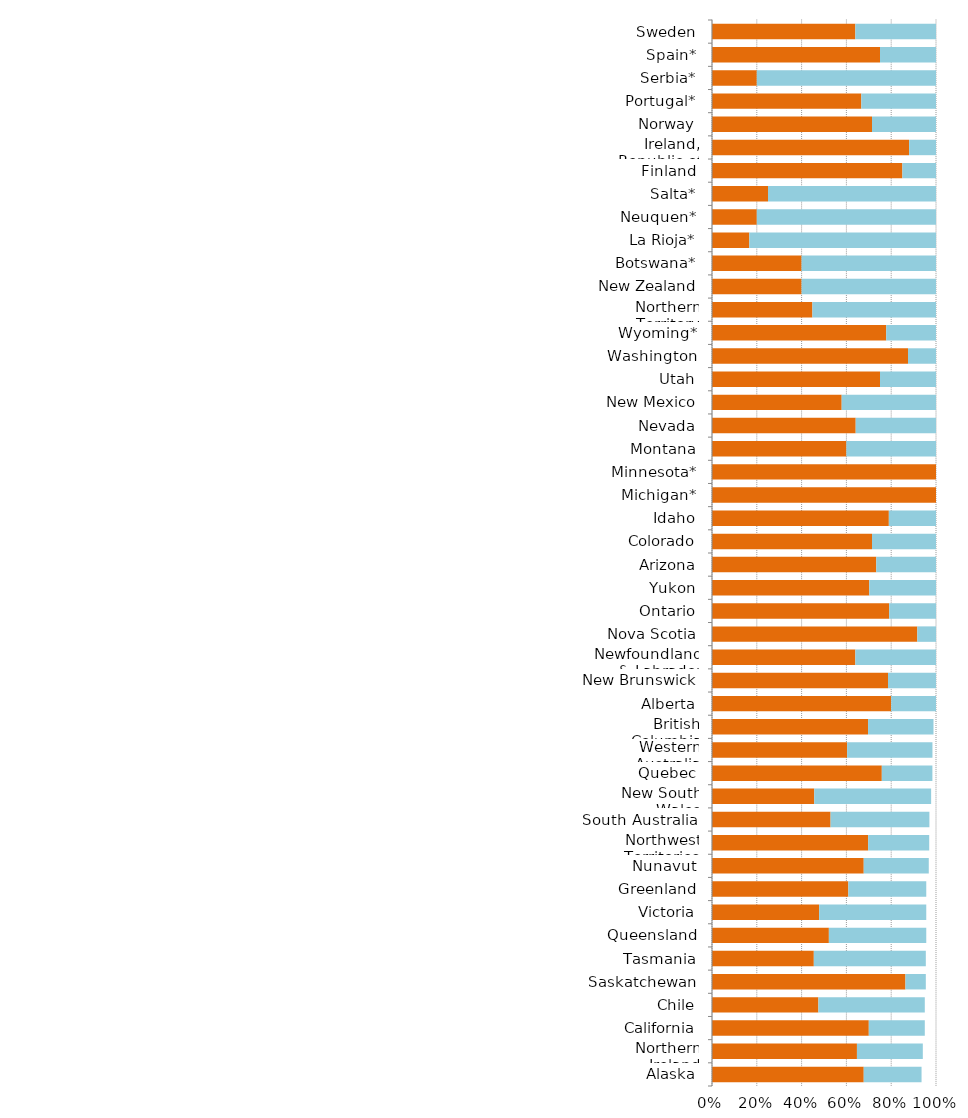
| Category | Series 0 | Series 1 |
|---|---|---|
| Alaska | 0.677 | 0.258 |
| Northern Ireland | 0.647 | 0.294 |
| California | 0.7 | 0.25 |
| Chile | 0.475 | 0.475 |
| Saskatchewan | 0.864 | 0.091 |
| Tasmania | 0.455 | 0.5 |
| Queensland | 0.522 | 0.435 |
| Victoria | 0.478 | 0.478 |
| Greenland | 0.609 | 0.348 |
| Nunavut | 0.677 | 0.29 |
| Northwest Territories | 0.697 | 0.273 |
| South Australia | 0.529 | 0.441 |
| New South Wales | 0.457 | 0.522 |
| Quebec | 0.758 | 0.226 |
| Western Australia | 0.603 | 0.381 |
| British Columbia | 0.697 | 0.292 |
| Alberta | 0.8 | 0.2 |
| New Brunswick | 0.786 | 0.214 |
| Newfoundland & Labrador | 0.64 | 0.36 |
| Nova Scotia | 0.917 | 0.083 |
| Ontario | 0.791 | 0.209 |
| Yukon | 0.702 | 0.298 |
| Arizona | 0.733 | 0.267 |
| Colorado | 0.714 | 0.286 |
| Idaho | 0.789 | 0.211 |
| Michigan* | 1 | 0 |
| Minnesota* | 1 | 0 |
| Montana | 0.6 | 0.4 |
| Nevada | 0.642 | 0.358 |
| New Mexico | 0.579 | 0.421 |
| Utah | 0.75 | 0.25 |
| Washington | 0.875 | 0.125 |
| Wyoming* | 0.778 | 0.222 |
| Northern Territory | 0.448 | 0.552 |
| New Zealand | 0.4 | 0.6 |
| Botswana* | 0.4 | 0.6 |
| La Rioja* | 0.167 | 0.833 |
| Neuquen* | 0.2 | 0.8 |
| Salta* | 0.25 | 0.75 |
| Finland | 0.85 | 0.15 |
| Ireland, Republic of | 0.88 | 0.12 |
| Norway | 0.714 | 0.286 |
| Portugal* | 0.667 | 0.333 |
| Serbia* | 0.2 | 0.8 |
| Spain* | 0.75 | 0.25 |
| Sweden | 0.64 | 0.36 |